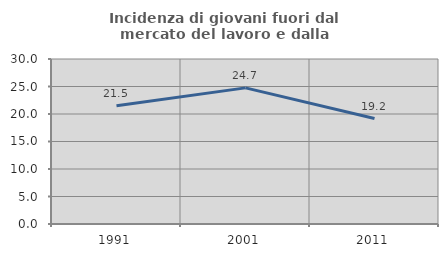
| Category | Incidenza di giovani fuori dal mercato del lavoro e dalla formazione  |
|---|---|
| 1991.0 | 21.488 |
| 2001.0 | 24.749 |
| 2011.0 | 19.178 |